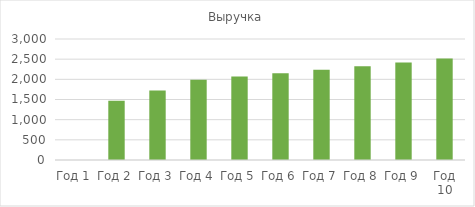
| Category | Выручка |
|---|---|
| Год 1 | 0 |
| Год 2 | 1470.976 |
| Год 3 | 1721.042 |
| Год 4 | 1988.76 |
| Год 5 | 2068.31 |
| Год 6 | 2151.042 |
| Год 7 | 2237.084 |
| Год 8 | 2326.567 |
| Год 9 | 2419.63 |
| Год 10 | 2516.415 |